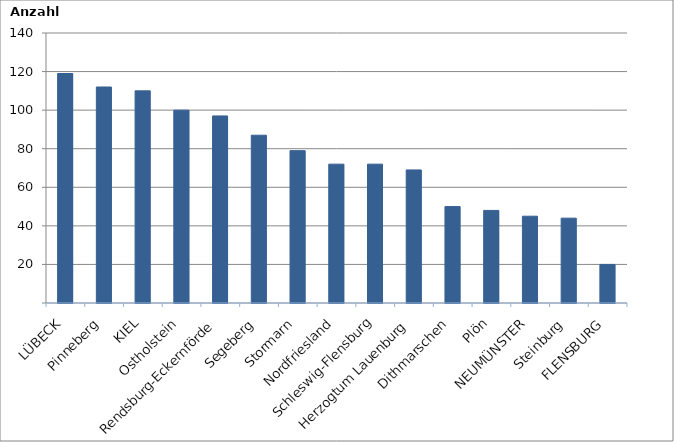
| Category | Series 0 |
|---|---|
| LÜBECK | 119 |
| Pinneberg | 112 |
| KIEL | 110 |
| Ostholstein | 100 |
| Rendsburg-Eckernförde | 97 |
| Segeberg | 87 |
| Stormarn | 79 |
| Nordfriesland | 72 |
| Schleswig-Flensburg | 72 |
| Herzogtum Lauenburg | 69 |
| Dithmarschen | 50 |
| Plön | 48 |
| NEUMÜNSTER | 45 |
| Steinburg | 44 |
| FLENSBURG | 20 |